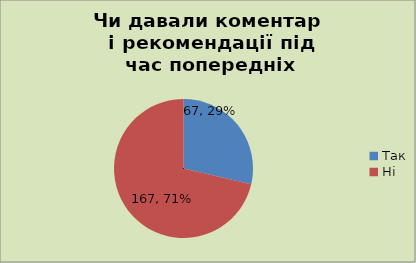
| Category | Кількість |
|---|---|
| Так | 67 |
| Ні | 167 |